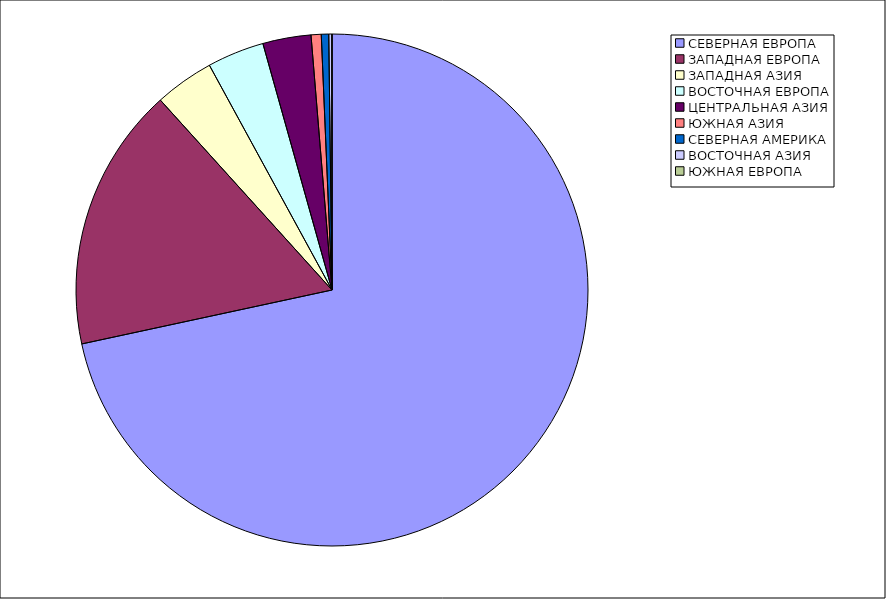
| Category | Оборот |
|---|---|
| СЕВЕРНАЯ ЕВРОПА | 71.62 |
| ЗАПАДНАЯ ЕВРОПА | 16.682 |
| ЗАПАДНАЯ АЗИЯ | 3.75 |
| ВОСТОЧНАЯ ЕВРОПА | 3.597 |
| ЦЕНТРАЛЬНАЯ АЗИЯ | 3.043 |
| ЮЖНАЯ АЗИЯ | 0.64 |
| СЕВЕРНАЯ АМЕРИКА | 0.467 |
| ВОСТОЧНАЯ АЗИЯ | 0.199 |
| ЮЖНАЯ ЕВРОПА | 0.002 |